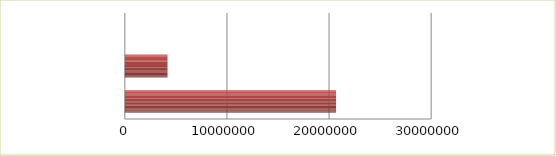
| Category | Series 0 | Series 1 |
|---|---|---|
| 0 | 2.5 | 20685728 |
| 1 | 2.6 | 4179310 |
| 2 | 2.7 | 0 |